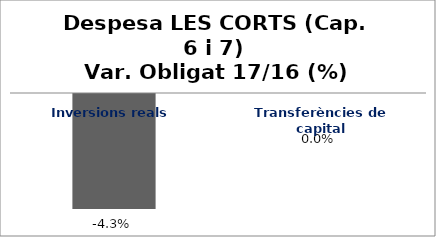
| Category | Series 0 |
|---|---|
| Inversions reals | -0.043 |
| Transferències de capital | 0 |